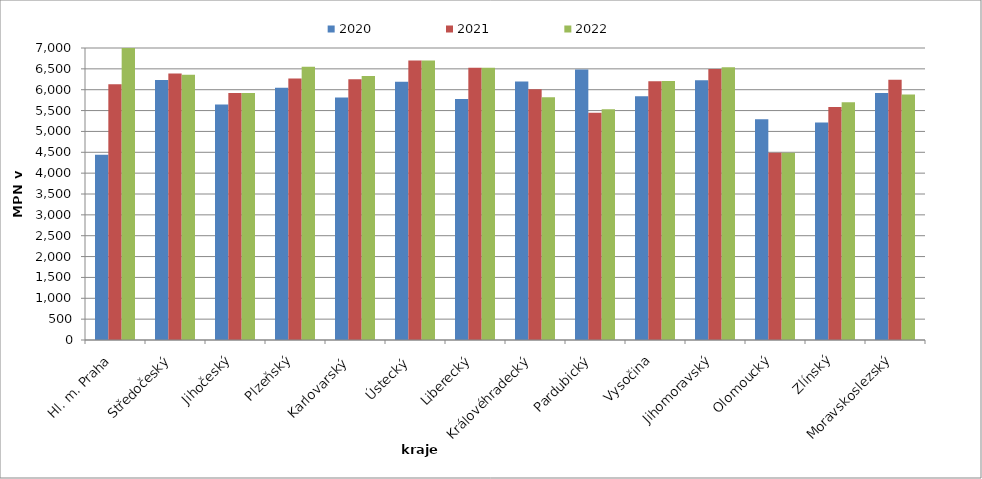
| Category | 2020 | 2021 | 2022 |
|---|---|---|---|
| Hl. m. Praha | 4442 | 6129 | 7565 |
| Středočeský | 6233 | 6391 | 6359 |
| Jihočeský | 5643 | 5919 | 5919 |
| Plzeňský | 6048 | 6267 | 6552 |
| Karlovarský  | 5813 | 6250 | 6327 |
| Ústecký   | 6193 | 6700 | 6700 |
| Liberecký | 5779 | 6528 | 6528 |
| Královéhradecký | 6195 | 6013 | 5817 |
| Pardubický | 6482 | 5446 | 5532 |
| Vysočina | 5846 | 6204 | 6209 |
| Jihomoravský | 6224 | 6494 | 6539 |
| Olomoucký | 5290 | 4491 | 4491 |
| Zlínský | 5216 | 5587 | 5697 |
| Moravskoslezský | 5923 | 6240 | 5885 |